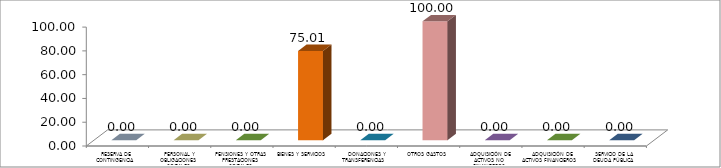
| Category | Series 0 |
|---|---|
|  RESERVA DE CONTINGENCIA | 0 |
|  PERSONAL Y OBLIGACIONES SOCIALES | 0 |
|  PENSIONES Y OTRAS PRESTACIONES SOCIALES | 0 |
|  BIENES Y SERVICIOS | 75.008 |
|   DONACIONES Y TRANSFERENCIAS | 0 |
|  OTROS GASTOS | 100 |
|  ADQUISICIÓN DE ACTIVOS NO FINANCIEROS | 0 |
|  ADQUISICIÓN DE ACTIVOS FINANCIEROS | 0 |
|  SERVICIO DE LA DEUDA PÚBLICA | 0 |